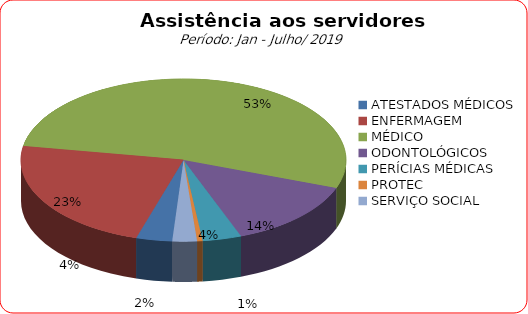
| Category | Series 0 |
|---|---|
| ATESTADOS MÉDICOS | 3.575 |
| ENFERMAGEM | 23.011 |
| MÉDICO | 52.876 |
| ODONTOLÓGICOS | 13.683 |
| PERÍCIAS MÉDICAS | 3.871 |
| PROTEC | 0.538 |
| SERVIÇO SOCIAL | 2.446 |